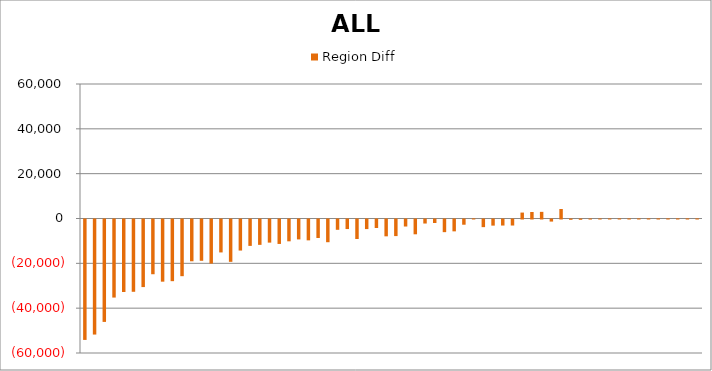
| Category | Region Diff |
|---|---|
| 0 | -53720.43 |
| 1 | -51326.622 |
| 2 | -45683.233 |
| 3 | -34825.345 |
| 4 | -32352.361 |
| 5 | -32249.601 |
| 6 | -30146.225 |
| 7 | -24415.77 |
| 8 | -27733.887 |
| 9 | -27509.836 |
| 10 | -25282.803 |
| 11 | -18638.084 |
| 12 | -18420.771 |
| 13 | -19666.367 |
| 14 | -14692.295 |
| 15 | -18884.716 |
| 16 | -13851.682 |
| 17 | -11775.049 |
| 18 | -11310.101 |
| 19 | -10315.72 |
| 20 | -10904.114 |
| 21 | -9729.952 |
| 22 | -8882.131 |
| 23 | -9303.75 |
| 24 | -8250.879 |
| 25 | -10134.936 |
| 26 | -4596.524 |
| 27 | -4259.606 |
| 28 | -8703.031 |
| 29 | -4273.553 |
| 30 | -3779.967 |
| 31 | -7508.654 |
| 32 | -7399.156 |
| 33 | -3131.398 |
| 34 | -6600.299 |
| 35 | -1797.2 |
| 36 | -1551.25 |
| 37 | -5643.45 |
| 38 | -5288.36 |
| 39 | -2328.732 |
| 40 | 52.023 |
| 41 | -3407.994 |
| 42 | -2732.472 |
| 43 | -2697.096 |
| 44 | -2688.196 |
| 45 | 2644.612 |
| 46 | 2904.04 |
| 47 | 2965.146 |
| 48 | -928.272 |
| 49 | 4243.292 |
| 50 | -136.513 |
| 51 | -128.09 |
| 52 | -21.961 |
| 53 | 8.362 |
| 54 | 21.839 |
| 55 | 37 |
| 56 | 37 |
| 57 | 37 |
| 58 | 37 |
| 59 | 37 |
| 60 | 37 |
| 61 | 37 |
| 62 | 37 |
| 63 | 37 |